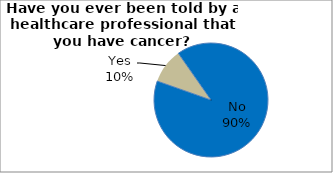
| Category | Series 0 |
|---|---|
| No | 90.105 |
| Yes | 9.895 |